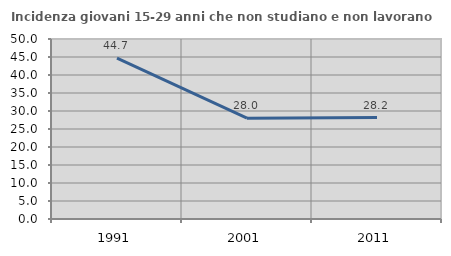
| Category | Incidenza giovani 15-29 anni che non studiano e non lavorano  |
|---|---|
| 1991.0 | 44.689 |
| 2001.0 | 28 |
| 2011.0 | 28.188 |